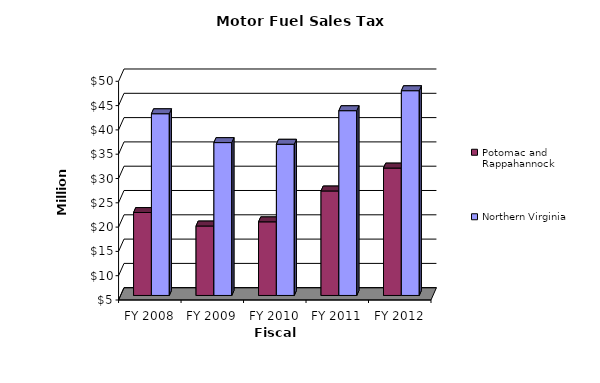
| Category | Potomac and Rappahannock | Northern Virginia |
|---|---|---|
| FY 2008 | 22.068 | 42.393 |
| FY 2009 | 19.294 | 36.458 |
| FY 2010 | 20.152 | 36.12 |
| FY 2011 | 26.501 | 43.022 |
| FY 2012 | 31.216 | 47.134 |